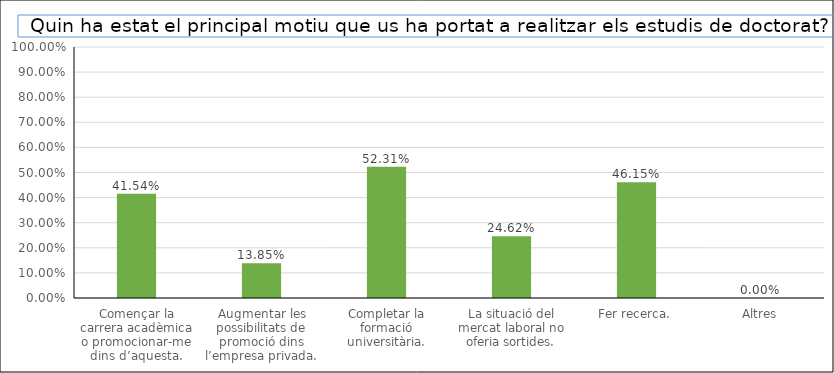
| Category | Series 0 |
|---|---|
| Començar la carrera acadèmica o promocionar-me dins d’aquesta. | 0.415 |
| Augmentar les possibilitats de promoció dins l’empresa privada. | 0.138 |
| Completar la formació universitària. | 0.523 |
| La situació del mercat laboral no oferia sortides. | 0.246 |
| Fer recerca. | 0.462 |
| Altres | 0 |